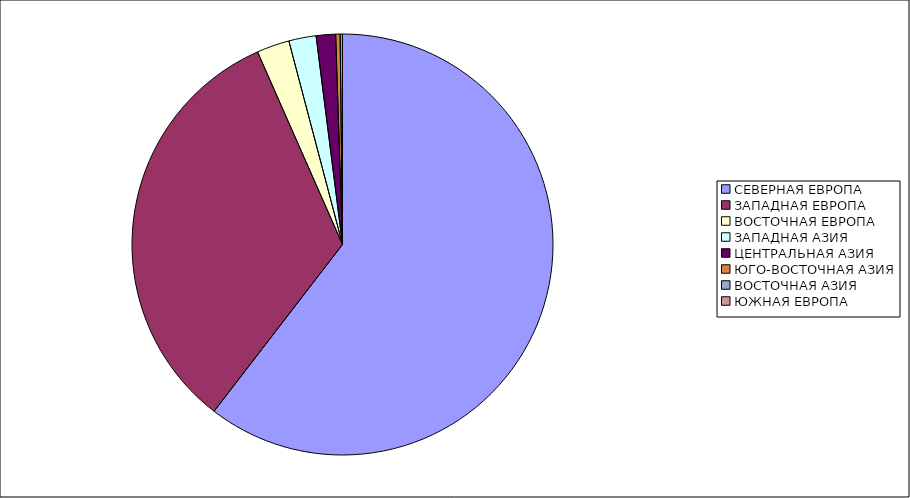
| Category | Оборот |
|---|---|
| СЕВЕРНАЯ ЕВРОПА | 60.444 |
| ЗАПАДНАЯ ЕВРОПА | 32.942 |
| ВОСТОЧНАЯ ЕВРОПА | 2.512 |
| ЗАПАДНАЯ АЗИЯ | 2.094 |
| ЦЕНТРАЛЬНАЯ АЗИЯ | 1.49 |
| ЮГО-ВОСТОЧНАЯ АЗИЯ | 0.337 |
| ВОСТОЧНАЯ АЗИЯ | 0.179 |
| ЮЖНАЯ ЕВРОПА | 0.001 |